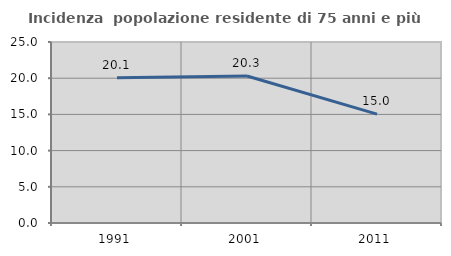
| Category | Incidenza  popolazione residente di 75 anni e più |
|---|---|
| 1991.0 | 20.059 |
| 2001.0 | 20.312 |
| 2011.0 | 15.031 |